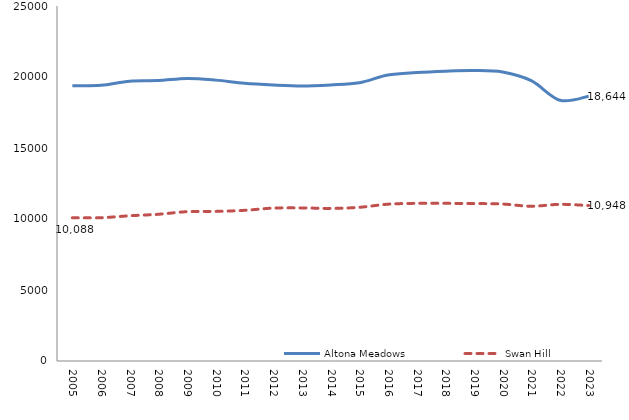
| Category | Altona Meadows | Swan Hill |
|---|---|---|
| 2005.0 | 19379 | 10088 |
| 2006.0 | 19411 | 10090 |
| 2007.0 | 19707 | 10228 |
| 2008.0 | 19746 | 10333 |
| 2009.0 | 19895 | 10516 |
| 2010.0 | 19780 | 10536 |
| 2011.0 | 19565 | 10610 |
| 2012.0 | 19443 | 10767 |
| 2013.0 | 19371 | 10782 |
| 2014.0 | 19444 | 10746 |
| 2015.0 | 19590 | 10822 |
| 2016.0 | 20141 | 11042 |
| 2017.0 | 20313 | 11104 |
| 2018.0 | 20409 | 11103 |
| 2019.0 | 20454 | 11089 |
| 2020.0 | 20351 | 11054 |
| 2021.0 | 19738 | 10899 |
| 2022.0 | 18360 | 11032 |
| 2023.0 | 18644 | 10948 |